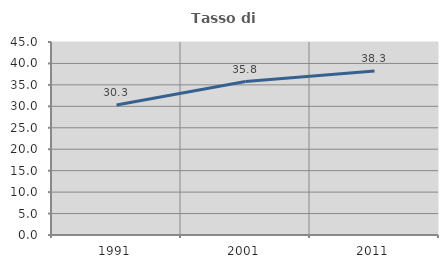
| Category | Tasso di occupazione   |
|---|---|
| 1991.0 | 30.296 |
| 2001.0 | 35.784 |
| 2011.0 | 38.251 |